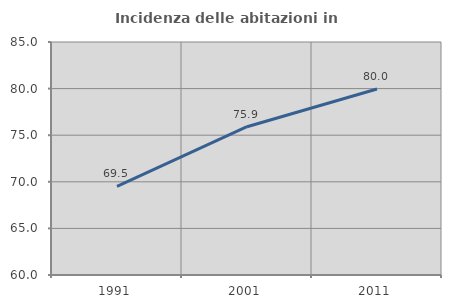
| Category | Incidenza delle abitazioni in proprietà  |
|---|---|
| 1991.0 | 69.502 |
| 2001.0 | 75.909 |
| 2011.0 | 79.956 |